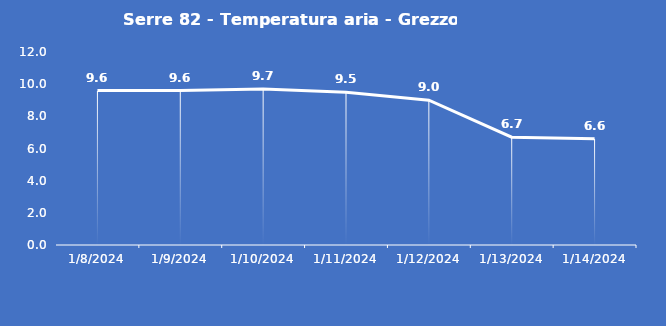
| Category | Serre 82 - Temperatura aria - Grezzo (°C) |
|---|---|
| 1/8/24 | 9.6 |
| 1/9/24 | 9.6 |
| 1/10/24 | 9.7 |
| 1/11/24 | 9.5 |
| 1/12/24 | 9 |
| 1/13/24 | 6.7 |
| 1/14/24 | 6.6 |